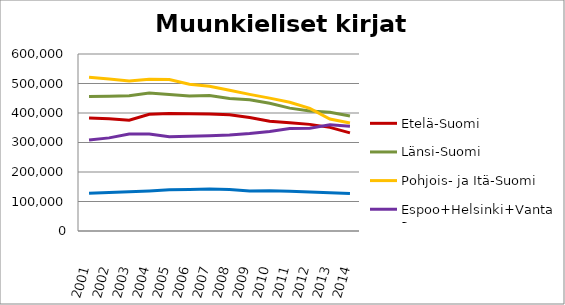
| Category | Etelä-Suomi | Länsi-Suomi | Pohjois- ja Itä-Suomi | Espoo+Helsinki+Vantaa | Muu Uusimaa |
|---|---|---|---|---|---|
| 2001.0 | 382993 | 455779 | 520851 | 308101 | 128012 |
| 2002.0 | 380316 | 457165 | 514914 | 315638 | 130554 |
| 2003.0 | 375426 | 458352 | 508662 | 329015 | 133006 |
| 2004.0 | 395444 | 467770 | 514733 | 329171 | 135569 |
| 2005.0 | 397967 | 463055 | 513459 | 319359 | 139523 |
| 2006.0 | 397463 | 457289 | 497556 | 320823 | 140328 |
| 2007.0 | 396964 | 459470 | 490895 | 322631 | 142469 |
| 2008.0 | 394207 | 449386 | 477270 | 325355 | 140504 |
| 2009.0 | 384595 | 444854 | 463072 | 330714 | 135869 |
| 2010.0 | 372384 | 433243 | 450404 | 337619 | 136419 |
| 2011.0 | 367312 | 416536 | 436582 | 347418 | 134763 |
| 2012.0 | 361425 | 406560 | 415613 | 348636 | 132363 |
| 2013.0 | 351368 | 402599 | 379442 | 360450 | 130001 |
| 2014.0 | 332524 | 389754 | 366171 | 355476 | 126985 |